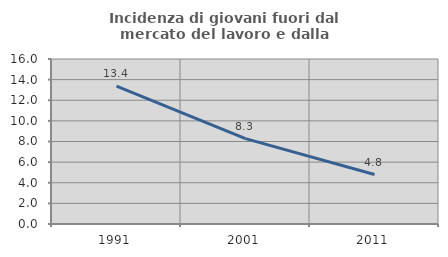
| Category | Incidenza di giovani fuori dal mercato del lavoro e dalla formazione  |
|---|---|
| 1991.0 | 13.376 |
| 2001.0 | 8.276 |
| 2011.0 | 4.8 |